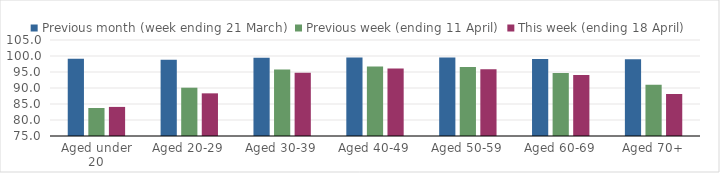
| Category | Previous month (week ending 21 March) | Previous week (ending 11 April) | This week (ending 18 April) |
|---|---|---|---|
| Aged under 20 | 99.143 | 83.752 | 84.09 |
| Aged 20-29 | 98.841 | 90.093 | 88.329 |
| Aged 30-39 | 99.47 | 95.811 | 94.743 |
| Aged 40-49 | 99.528 | 96.734 | 96.062 |
| Aged 50-59 | 99.5 | 96.559 | 95.861 |
| Aged 60-69 | 99.024 | 94.662 | 94.036 |
| Aged 70+ | 98.961 | 90.988 | 88.132 |